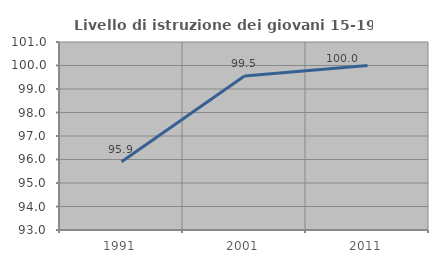
| Category | Livello di istruzione dei giovani 15-19 anni |
|---|---|
| 1991.0 | 95.906 |
| 2001.0 | 99.55 |
| 2011.0 | 100 |